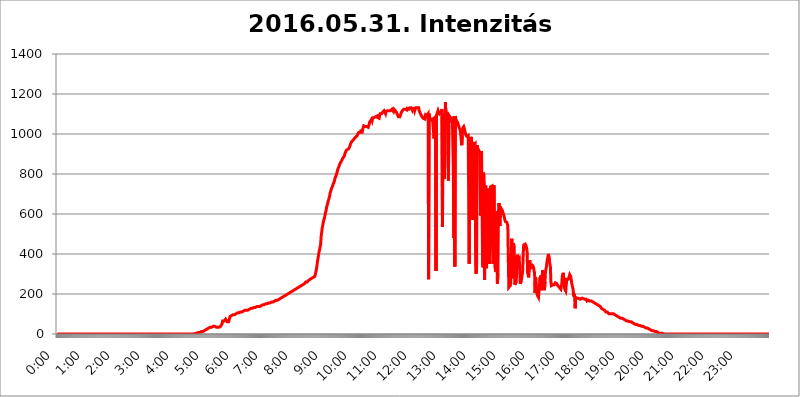
| Category | 2016.05.31. Intenzitás [W/m^2] |
|---|---|
| 0.0 | 0 |
| 0.0006944444444444445 | 0 |
| 0.001388888888888889 | 0 |
| 0.0020833333333333333 | 0 |
| 0.002777777777777778 | 0 |
| 0.003472222222222222 | 0 |
| 0.004166666666666667 | 0 |
| 0.004861111111111111 | 0 |
| 0.005555555555555556 | 0 |
| 0.0062499999999999995 | 0 |
| 0.006944444444444444 | 0 |
| 0.007638888888888889 | 0 |
| 0.008333333333333333 | 0 |
| 0.009027777777777779 | 0 |
| 0.009722222222222222 | 0 |
| 0.010416666666666666 | 0 |
| 0.011111111111111112 | 0 |
| 0.011805555555555555 | 0 |
| 0.012499999999999999 | 0 |
| 0.013194444444444444 | 0 |
| 0.013888888888888888 | 0 |
| 0.014583333333333332 | 0 |
| 0.015277777777777777 | 0 |
| 0.015972222222222224 | 0 |
| 0.016666666666666666 | 0 |
| 0.017361111111111112 | 0 |
| 0.018055555555555557 | 0 |
| 0.01875 | 0 |
| 0.019444444444444445 | 0 |
| 0.02013888888888889 | 0 |
| 0.020833333333333332 | 0 |
| 0.02152777777777778 | 0 |
| 0.022222222222222223 | 0 |
| 0.02291666666666667 | 0 |
| 0.02361111111111111 | 0 |
| 0.024305555555555556 | 0 |
| 0.024999999999999998 | 0 |
| 0.025694444444444447 | 0 |
| 0.02638888888888889 | 0 |
| 0.027083333333333334 | 0 |
| 0.027777777777777776 | 0 |
| 0.02847222222222222 | 0 |
| 0.029166666666666664 | 0 |
| 0.029861111111111113 | 0 |
| 0.030555555555555555 | 0 |
| 0.03125 | 0 |
| 0.03194444444444445 | 0 |
| 0.03263888888888889 | 0 |
| 0.03333333333333333 | 0 |
| 0.034027777777777775 | 0 |
| 0.034722222222222224 | 0 |
| 0.035416666666666666 | 0 |
| 0.036111111111111115 | 0 |
| 0.03680555555555556 | 0 |
| 0.0375 | 0 |
| 0.03819444444444444 | 0 |
| 0.03888888888888889 | 0 |
| 0.03958333333333333 | 0 |
| 0.04027777777777778 | 0 |
| 0.04097222222222222 | 0 |
| 0.041666666666666664 | 0 |
| 0.042361111111111106 | 0 |
| 0.04305555555555556 | 0 |
| 0.043750000000000004 | 0 |
| 0.044444444444444446 | 0 |
| 0.04513888888888889 | 0 |
| 0.04583333333333334 | 0 |
| 0.04652777777777778 | 0 |
| 0.04722222222222222 | 0 |
| 0.04791666666666666 | 0 |
| 0.04861111111111111 | 0 |
| 0.049305555555555554 | 0 |
| 0.049999999999999996 | 0 |
| 0.05069444444444445 | 0 |
| 0.051388888888888894 | 0 |
| 0.052083333333333336 | 0 |
| 0.05277777777777778 | 0 |
| 0.05347222222222222 | 0 |
| 0.05416666666666667 | 0 |
| 0.05486111111111111 | 0 |
| 0.05555555555555555 | 0 |
| 0.05625 | 0 |
| 0.05694444444444444 | 0 |
| 0.057638888888888885 | 0 |
| 0.05833333333333333 | 0 |
| 0.05902777777777778 | 0 |
| 0.059722222222222225 | 0 |
| 0.06041666666666667 | 0 |
| 0.061111111111111116 | 0 |
| 0.06180555555555556 | 0 |
| 0.0625 | 0 |
| 0.06319444444444444 | 0 |
| 0.06388888888888888 | 0 |
| 0.06458333333333334 | 0 |
| 0.06527777777777778 | 0 |
| 0.06597222222222222 | 0 |
| 0.06666666666666667 | 0 |
| 0.06736111111111111 | 0 |
| 0.06805555555555555 | 0 |
| 0.06874999999999999 | 0 |
| 0.06944444444444443 | 0 |
| 0.07013888888888889 | 0 |
| 0.07083333333333333 | 0 |
| 0.07152777777777779 | 0 |
| 0.07222222222222223 | 0 |
| 0.07291666666666667 | 0 |
| 0.07361111111111111 | 0 |
| 0.07430555555555556 | 0 |
| 0.075 | 0 |
| 0.07569444444444444 | 0 |
| 0.0763888888888889 | 0 |
| 0.07708333333333334 | 0 |
| 0.07777777777777778 | 0 |
| 0.07847222222222222 | 0 |
| 0.07916666666666666 | 0 |
| 0.0798611111111111 | 0 |
| 0.08055555555555556 | 0 |
| 0.08125 | 0 |
| 0.08194444444444444 | 0 |
| 0.08263888888888889 | 0 |
| 0.08333333333333333 | 0 |
| 0.08402777777777777 | 0 |
| 0.08472222222222221 | 0 |
| 0.08541666666666665 | 0 |
| 0.08611111111111112 | 0 |
| 0.08680555555555557 | 0 |
| 0.08750000000000001 | 0 |
| 0.08819444444444445 | 0 |
| 0.08888888888888889 | 0 |
| 0.08958333333333333 | 0 |
| 0.09027777777777778 | 0 |
| 0.09097222222222222 | 0 |
| 0.09166666666666667 | 0 |
| 0.09236111111111112 | 0 |
| 0.09305555555555556 | 0 |
| 0.09375 | 0 |
| 0.09444444444444444 | 0 |
| 0.09513888888888888 | 0 |
| 0.09583333333333333 | 0 |
| 0.09652777777777777 | 0 |
| 0.09722222222222222 | 0 |
| 0.09791666666666667 | 0 |
| 0.09861111111111111 | 0 |
| 0.09930555555555555 | 0 |
| 0.09999999999999999 | 0 |
| 0.10069444444444443 | 0 |
| 0.1013888888888889 | 0 |
| 0.10208333333333335 | 0 |
| 0.10277777777777779 | 0 |
| 0.10347222222222223 | 0 |
| 0.10416666666666667 | 0 |
| 0.10486111111111111 | 0 |
| 0.10555555555555556 | 0 |
| 0.10625 | 0 |
| 0.10694444444444444 | 0 |
| 0.1076388888888889 | 0 |
| 0.10833333333333334 | 0 |
| 0.10902777777777778 | 0 |
| 0.10972222222222222 | 0 |
| 0.1111111111111111 | 0 |
| 0.11180555555555556 | 0 |
| 0.11180555555555556 | 0 |
| 0.1125 | 0 |
| 0.11319444444444444 | 0 |
| 0.11388888888888889 | 0 |
| 0.11458333333333333 | 0 |
| 0.11527777777777777 | 0 |
| 0.11597222222222221 | 0 |
| 0.11666666666666665 | 0 |
| 0.1173611111111111 | 0 |
| 0.11805555555555557 | 0 |
| 0.11944444444444445 | 0 |
| 0.12013888888888889 | 0 |
| 0.12083333333333333 | 0 |
| 0.12152777777777778 | 0 |
| 0.12222222222222223 | 0 |
| 0.12291666666666667 | 0 |
| 0.12291666666666667 | 0 |
| 0.12361111111111112 | 0 |
| 0.12430555555555556 | 0 |
| 0.125 | 0 |
| 0.12569444444444444 | 0 |
| 0.12638888888888888 | 0 |
| 0.12708333333333333 | 0 |
| 0.16875 | 0 |
| 0.12847222222222224 | 0 |
| 0.12916666666666668 | 0 |
| 0.12986111111111112 | 0 |
| 0.13055555555555556 | 0 |
| 0.13125 | 0 |
| 0.13194444444444445 | 0 |
| 0.1326388888888889 | 0 |
| 0.13333333333333333 | 0 |
| 0.13402777777777777 | 0 |
| 0.13402777777777777 | 0 |
| 0.13472222222222222 | 0 |
| 0.13541666666666666 | 0 |
| 0.1361111111111111 | 0 |
| 0.13749999999999998 | 0 |
| 0.13819444444444443 | 0 |
| 0.1388888888888889 | 0 |
| 0.13958333333333334 | 0 |
| 0.14027777777777778 | 0 |
| 0.14097222222222222 | 0 |
| 0.14166666666666666 | 0 |
| 0.1423611111111111 | 0 |
| 0.14305555555555557 | 0 |
| 0.14375000000000002 | 0 |
| 0.14444444444444446 | 0 |
| 0.1451388888888889 | 0 |
| 0.1451388888888889 | 0 |
| 0.14652777777777778 | 0 |
| 0.14722222222222223 | 0 |
| 0.14791666666666667 | 0 |
| 0.1486111111111111 | 0 |
| 0.14930555555555555 | 0 |
| 0.15 | 0 |
| 0.15069444444444444 | 0 |
| 0.15138888888888888 | 0 |
| 0.15208333333333332 | 0 |
| 0.15277777777777776 | 0 |
| 0.15347222222222223 | 0 |
| 0.15416666666666667 | 0 |
| 0.15486111111111112 | 0 |
| 0.15555555555555556 | 0 |
| 0.15625 | 0 |
| 0.15694444444444444 | 0 |
| 0.15763888888888888 | 0 |
| 0.15833333333333333 | 0 |
| 0.15902777777777777 | 0 |
| 0.15972222222222224 | 0 |
| 0.16041666666666668 | 0 |
| 0.16111111111111112 | 0 |
| 0.16180555555555556 | 0 |
| 0.1625 | 0 |
| 0.16319444444444445 | 0 |
| 0.1638888888888889 | 0 |
| 0.16458333333333333 | 0 |
| 0.16527777777777777 | 0 |
| 0.16597222222222222 | 0 |
| 0.16666666666666666 | 0 |
| 0.1673611111111111 | 0 |
| 0.16805555555555554 | 0 |
| 0.16874999999999998 | 0 |
| 0.16944444444444443 | 0 |
| 0.17013888888888887 | 0 |
| 0.1708333333333333 | 0 |
| 0.17152777777777775 | 0 |
| 0.17222222222222225 | 0 |
| 0.1729166666666667 | 0 |
| 0.17361111111111113 | 0 |
| 0.17430555555555557 | 0 |
| 0.17500000000000002 | 0 |
| 0.17569444444444446 | 0 |
| 0.1763888888888889 | 0 |
| 0.17708333333333334 | 0 |
| 0.17777777777777778 | 0 |
| 0.17847222222222223 | 0 |
| 0.17916666666666667 | 0 |
| 0.1798611111111111 | 0 |
| 0.18055555555555555 | 0 |
| 0.18125 | 0 |
| 0.18194444444444444 | 0 |
| 0.1826388888888889 | 0 |
| 0.18333333333333335 | 0 |
| 0.1840277777777778 | 0 |
| 0.18472222222222223 | 0 |
| 0.18541666666666667 | 0 |
| 0.18611111111111112 | 0 |
| 0.18680555555555556 | 0 |
| 0.1875 | 0 |
| 0.18819444444444444 | 0 |
| 0.18888888888888888 | 0 |
| 0.18958333333333333 | 0 |
| 0.19027777777777777 | 0 |
| 0.1909722222222222 | 0 |
| 0.19166666666666665 | 0 |
| 0.19236111111111112 | 3.525 |
| 0.19305555555555554 | 3.525 |
| 0.19375 | 3.525 |
| 0.19444444444444445 | 3.525 |
| 0.1951388888888889 | 3.525 |
| 0.19583333333333333 | 3.525 |
| 0.19652777777777777 | 3.525 |
| 0.19722222222222222 | 3.525 |
| 0.19791666666666666 | 7.887 |
| 0.1986111111111111 | 7.887 |
| 0.19930555555555554 | 7.887 |
| 0.19999999999999998 | 7.887 |
| 0.20069444444444443 | 7.887 |
| 0.20138888888888887 | 12.257 |
| 0.2020833333333333 | 12.257 |
| 0.2027777777777778 | 12.257 |
| 0.2034722222222222 | 12.257 |
| 0.2041666666666667 | 12.257 |
| 0.20486111111111113 | 16.636 |
| 0.20555555555555557 | 16.636 |
| 0.20625000000000002 | 16.636 |
| 0.20694444444444446 | 21.024 |
| 0.2076388888888889 | 21.024 |
| 0.20833333333333334 | 21.024 |
| 0.20902777777777778 | 21.024 |
| 0.20972222222222223 | 25.419 |
| 0.21041666666666667 | 25.419 |
| 0.2111111111111111 | 25.419 |
| 0.21180555555555555 | 29.823 |
| 0.2125 | 29.823 |
| 0.21319444444444444 | 29.823 |
| 0.2138888888888889 | 29.823 |
| 0.21458333333333335 | 34.234 |
| 0.2152777777777778 | 34.234 |
| 0.21597222222222223 | 34.234 |
| 0.21666666666666667 | 34.234 |
| 0.21736111111111112 | 34.234 |
| 0.21805555555555556 | 38.653 |
| 0.21875 | 38.653 |
| 0.21944444444444444 | 38.653 |
| 0.22013888888888888 | 38.653 |
| 0.22083333333333333 | 38.653 |
| 0.22152777777777777 | 43.079 |
| 0.2222222222222222 | 38.653 |
| 0.22291666666666665 | 34.234 |
| 0.2236111111111111 | 38.653 |
| 0.22430555555555556 | 38.653 |
| 0.225 | 34.234 |
| 0.22569444444444445 | 38.653 |
| 0.2263888888888889 | 34.234 |
| 0.22708333333333333 | 34.234 |
| 0.22777777777777777 | 34.234 |
| 0.22847222222222222 | 34.234 |
| 0.22916666666666666 | 38.653 |
| 0.2298611111111111 | 38.653 |
| 0.23055555555555554 | 38.653 |
| 0.23124999999999998 | 51.951 |
| 0.23194444444444443 | 65.31 |
| 0.23263888888888887 | 65.31 |
| 0.2333333333333333 | 69.775 |
| 0.2340277777777778 | 65.31 |
| 0.2347222222222222 | 69.775 |
| 0.2354166666666667 | 69.775 |
| 0.23611111111111113 | 74.246 |
| 0.23680555555555557 | 74.246 |
| 0.23750000000000002 | 69.775 |
| 0.23819444444444446 | 60.85 |
| 0.2388888888888889 | 56.398 |
| 0.23958333333333334 | 56.398 |
| 0.24027777777777778 | 60.85 |
| 0.24097222222222223 | 65.31 |
| 0.24166666666666667 | 78.722 |
| 0.2423611111111111 | 87.692 |
| 0.24305555555555555 | 87.692 |
| 0.24375 | 92.184 |
| 0.24444444444444446 | 92.184 |
| 0.24513888888888888 | 92.184 |
| 0.24583333333333335 | 92.184 |
| 0.2465277777777778 | 96.682 |
| 0.24722222222222223 | 96.682 |
| 0.24791666666666667 | 96.682 |
| 0.24861111111111112 | 96.682 |
| 0.24930555555555556 | 101.184 |
| 0.25 | 101.184 |
| 0.25069444444444444 | 101.184 |
| 0.2513888888888889 | 101.184 |
| 0.2520833333333333 | 101.184 |
| 0.25277777777777777 | 105.69 |
| 0.2534722222222222 | 105.69 |
| 0.25416666666666665 | 105.69 |
| 0.2548611111111111 | 105.69 |
| 0.2555555555555556 | 110.201 |
| 0.25625000000000003 | 110.201 |
| 0.2569444444444445 | 110.201 |
| 0.2576388888888889 | 110.201 |
| 0.25833333333333336 | 110.201 |
| 0.2590277777777778 | 110.201 |
| 0.25972222222222224 | 110.201 |
| 0.2604166666666667 | 114.716 |
| 0.2611111111111111 | 114.716 |
| 0.26180555555555557 | 114.716 |
| 0.2625 | 114.716 |
| 0.26319444444444445 | 119.235 |
| 0.2638888888888889 | 119.235 |
| 0.26458333333333334 | 119.235 |
| 0.2652777777777778 | 119.235 |
| 0.2659722222222222 | 119.235 |
| 0.26666666666666666 | 119.235 |
| 0.2673611111111111 | 119.235 |
| 0.26805555555555555 | 123.758 |
| 0.26875 | 123.758 |
| 0.26944444444444443 | 123.758 |
| 0.2701388888888889 | 123.758 |
| 0.2708333333333333 | 128.284 |
| 0.27152777777777776 | 128.284 |
| 0.2722222222222222 | 128.284 |
| 0.27291666666666664 | 128.284 |
| 0.2736111111111111 | 128.284 |
| 0.2743055555555555 | 128.284 |
| 0.27499999999999997 | 128.284 |
| 0.27569444444444446 | 132.814 |
| 0.27638888888888885 | 132.814 |
| 0.27708333333333335 | 132.814 |
| 0.2777777777777778 | 132.814 |
| 0.27847222222222223 | 132.814 |
| 0.2791666666666667 | 132.814 |
| 0.2798611111111111 | 137.347 |
| 0.28055555555555556 | 137.347 |
| 0.28125 | 137.347 |
| 0.28194444444444444 | 137.347 |
| 0.2826388888888889 | 137.347 |
| 0.2833333333333333 | 137.347 |
| 0.28402777777777777 | 137.347 |
| 0.2847222222222222 | 141.884 |
| 0.28541666666666665 | 141.884 |
| 0.28611111111111115 | 141.884 |
| 0.28680555555555554 | 141.884 |
| 0.28750000000000003 | 141.884 |
| 0.2881944444444445 | 146.423 |
| 0.2888888888888889 | 146.423 |
| 0.28958333333333336 | 146.423 |
| 0.2902777777777778 | 146.423 |
| 0.29097222222222224 | 146.423 |
| 0.2916666666666667 | 146.423 |
| 0.2923611111111111 | 150.964 |
| 0.29305555555555557 | 150.964 |
| 0.29375 | 150.964 |
| 0.29444444444444445 | 150.964 |
| 0.2951388888888889 | 150.964 |
| 0.29583333333333334 | 150.964 |
| 0.2965277777777778 | 155.509 |
| 0.2972222222222222 | 155.509 |
| 0.29791666666666666 | 155.509 |
| 0.2986111111111111 | 155.509 |
| 0.29930555555555555 | 155.509 |
| 0.3 | 155.509 |
| 0.30069444444444443 | 160.056 |
| 0.3013888888888889 | 160.056 |
| 0.3020833333333333 | 160.056 |
| 0.30277777777777776 | 160.056 |
| 0.3034722222222222 | 164.605 |
| 0.30416666666666664 | 164.605 |
| 0.3048611111111111 | 164.605 |
| 0.3055555555555555 | 164.605 |
| 0.30624999999999997 | 164.605 |
| 0.3069444444444444 | 169.156 |
| 0.3076388888888889 | 164.605 |
| 0.30833333333333335 | 164.605 |
| 0.3090277777777778 | 169.156 |
| 0.30972222222222223 | 169.156 |
| 0.3104166666666667 | 173.709 |
| 0.3111111111111111 | 173.709 |
| 0.31180555555555556 | 173.709 |
| 0.3125 | 178.264 |
| 0.31319444444444444 | 178.264 |
| 0.3138888888888889 | 178.264 |
| 0.3145833333333333 | 182.82 |
| 0.31527777777777777 | 182.82 |
| 0.3159722222222222 | 182.82 |
| 0.31666666666666665 | 187.378 |
| 0.31736111111111115 | 187.378 |
| 0.31805555555555554 | 187.378 |
| 0.31875000000000003 | 191.937 |
| 0.3194444444444445 | 191.937 |
| 0.3201388888888889 | 191.937 |
| 0.32083333333333336 | 196.497 |
| 0.3215277777777778 | 196.497 |
| 0.32222222222222224 | 196.497 |
| 0.3229166666666667 | 201.058 |
| 0.3236111111111111 | 201.058 |
| 0.32430555555555557 | 201.058 |
| 0.325 | 201.058 |
| 0.32569444444444445 | 205.62 |
| 0.3263888888888889 | 205.62 |
| 0.32708333333333334 | 210.182 |
| 0.3277777777777778 | 210.182 |
| 0.3284722222222222 | 210.182 |
| 0.32916666666666666 | 214.746 |
| 0.3298611111111111 | 214.746 |
| 0.33055555555555555 | 214.746 |
| 0.33125 | 219.309 |
| 0.33194444444444443 | 219.309 |
| 0.3326388888888889 | 219.309 |
| 0.3333333333333333 | 223.873 |
| 0.3340277777777778 | 223.873 |
| 0.3347222222222222 | 228.436 |
| 0.3354166666666667 | 228.436 |
| 0.3361111111111111 | 228.436 |
| 0.3368055555555556 | 233 |
| 0.33749999999999997 | 233 |
| 0.33819444444444446 | 233 |
| 0.33888888888888885 | 233 |
| 0.33958333333333335 | 233 |
| 0.34027777777777773 | 237.564 |
| 0.34097222222222223 | 242.127 |
| 0.3416666666666666 | 242.127 |
| 0.3423611111111111 | 242.127 |
| 0.3430555555555555 | 246.689 |
| 0.34375 | 246.689 |
| 0.3444444444444445 | 246.689 |
| 0.3451388888888889 | 251.251 |
| 0.3458333333333334 | 251.251 |
| 0.34652777777777777 | 251.251 |
| 0.34722222222222227 | 255.813 |
| 0.34791666666666665 | 255.813 |
| 0.34861111111111115 | 260.373 |
| 0.34930555555555554 | 260.373 |
| 0.35000000000000003 | 260.373 |
| 0.3506944444444444 | 260.373 |
| 0.3513888888888889 | 264.932 |
| 0.3520833333333333 | 264.932 |
| 0.3527777777777778 | 269.49 |
| 0.3534722222222222 | 269.49 |
| 0.3541666666666667 | 269.49 |
| 0.3548611111111111 | 274.047 |
| 0.35555555555555557 | 274.047 |
| 0.35625 | 278.603 |
| 0.35694444444444445 | 278.603 |
| 0.3576388888888889 | 278.603 |
| 0.35833333333333334 | 283.156 |
| 0.3590277777777778 | 283.156 |
| 0.3597222222222222 | 287.709 |
| 0.36041666666666666 | 287.709 |
| 0.3611111111111111 | 287.709 |
| 0.36180555555555555 | 296.808 |
| 0.3625 | 305.898 |
| 0.36319444444444443 | 319.517 |
| 0.3638888888888889 | 333.113 |
| 0.3645833333333333 | 351.198 |
| 0.3652777777777778 | 369.23 |
| 0.3659722222222222 | 382.715 |
| 0.3666666666666667 | 400.638 |
| 0.3673611111111111 | 414.035 |
| 0.3680555555555556 | 422.943 |
| 0.36874999999999997 | 436.27 |
| 0.36944444444444446 | 449.551 |
| 0.37013888888888885 | 489.108 |
| 0.37083333333333335 | 506.542 |
| 0.37152777777777773 | 528.2 |
| 0.37222222222222223 | 541.121 |
| 0.3729166666666666 | 553.986 |
| 0.3736111111111111 | 566.793 |
| 0.3743055555555555 | 575.299 |
| 0.375 | 583.779 |
| 0.3756944444444445 | 596.45 |
| 0.3763888888888889 | 609.062 |
| 0.3770833333333334 | 617.436 |
| 0.37777777777777777 | 634.105 |
| 0.37847222222222227 | 634.105 |
| 0.37916666666666665 | 650.667 |
| 0.37986111111111115 | 663.019 |
| 0.38055555555555554 | 671.22 |
| 0.38125000000000003 | 675.311 |
| 0.3819444444444444 | 687.544 |
| 0.3826388888888889 | 703.762 |
| 0.3833333333333333 | 711.832 |
| 0.3840277777777778 | 719.877 |
| 0.3847222222222222 | 727.896 |
| 0.3854166666666667 | 731.896 |
| 0.3861111111111111 | 739.877 |
| 0.38680555555555557 | 747.834 |
| 0.3875 | 751.803 |
| 0.38819444444444445 | 759.723 |
| 0.3888888888888889 | 767.62 |
| 0.38958333333333334 | 779.42 |
| 0.3902777777777778 | 783.342 |
| 0.3909722222222222 | 791.169 |
| 0.39166666666666666 | 798.974 |
| 0.3923611111111111 | 806.757 |
| 0.39305555555555555 | 818.392 |
| 0.39375 | 826.123 |
| 0.39444444444444443 | 829.981 |
| 0.3951388888888889 | 837.682 |
| 0.3958333333333333 | 845.365 |
| 0.3965277777777778 | 849.199 |
| 0.3972222222222222 | 856.855 |
| 0.3979166666666667 | 860.676 |
| 0.3986111111111111 | 864.493 |
| 0.3993055555555556 | 868.305 |
| 0.39999999999999997 | 875.918 |
| 0.40069444444444446 | 879.719 |
| 0.40138888888888885 | 883.516 |
| 0.40208333333333335 | 887.309 |
| 0.40277777777777773 | 891.099 |
| 0.40347222222222223 | 902.447 |
| 0.4041666666666666 | 906.223 |
| 0.4048611111111111 | 913.766 |
| 0.4055555555555555 | 917.534 |
| 0.40625 | 921.298 |
| 0.4069444444444445 | 921.298 |
| 0.4076388888888889 | 925.06 |
| 0.4083333333333334 | 925.06 |
| 0.40902777777777777 | 928.819 |
| 0.40972222222222227 | 932.576 |
| 0.41041666666666665 | 940.082 |
| 0.41111111111111115 | 947.58 |
| 0.41180555555555554 | 955.071 |
| 0.41250000000000003 | 958.814 |
| 0.4131944444444444 | 962.555 |
| 0.4138888888888889 | 966.295 |
| 0.4145833333333333 | 966.295 |
| 0.4152777777777778 | 970.034 |
| 0.4159722222222222 | 966.295 |
| 0.4166666666666667 | 977.508 |
| 0.4173611111111111 | 977.508 |
| 0.41805555555555557 | 981.244 |
| 0.41875 | 984.98 |
| 0.41944444444444445 | 988.714 |
| 0.4201388888888889 | 988.714 |
| 0.42083333333333334 | 992.448 |
| 0.4215277777777778 | 999.916 |
| 0.4222222222222222 | 1003.65 |
| 0.42291666666666666 | 1007.383 |
| 0.4236111111111111 | 1003.65 |
| 0.42430555555555555 | 1007.383 |
| 0.425 | 1007.383 |
| 0.42569444444444443 | 1014.852 |
| 0.4263888888888889 | 1014.852 |
| 0.4270833333333333 | 1014.852 |
| 0.4277777777777778 | 1011.118 |
| 0.4284722222222222 | 1026.06 |
| 0.4291666666666667 | 1029.798 |
| 0.4298611111111111 | 1041.019 |
| 0.4305555555555556 | 1041.019 |
| 0.43124999999999997 | 1037.277 |
| 0.43194444444444446 | 1037.277 |
| 0.43263888888888885 | 1037.277 |
| 0.43333333333333335 | 1033.537 |
| 0.43402777777777773 | 1037.277 |
| 0.43472222222222223 | 1033.537 |
| 0.4354166666666666 | 1037.277 |
| 0.4361111111111111 | 1033.537 |
| 0.4368055555555555 | 1041.019 |
| 0.4375 | 1048.508 |
| 0.4381944444444445 | 1059.756 |
| 0.4388888888888889 | 1059.756 |
| 0.4395833333333334 | 1067.267 |
| 0.44027777777777777 | 1067.267 |
| 0.44097222222222227 | 1074.789 |
| 0.44166666666666665 | 1067.267 |
| 0.44236111111111115 | 1078.555 |
| 0.44305555555555554 | 1082.324 |
| 0.44375000000000003 | 1078.555 |
| 0.4444444444444444 | 1082.324 |
| 0.4451388888888889 | 1078.555 |
| 0.4458333333333333 | 1082.324 |
| 0.4465277777777778 | 1086.097 |
| 0.4472222222222222 | 1086.097 |
| 0.4479166666666667 | 1086.097 |
| 0.4486111111111111 | 1089.873 |
| 0.44930555555555557 | 1082.324 |
| 0.45 | 1086.097 |
| 0.45069444444444445 | 1082.324 |
| 0.4513888888888889 | 1078.555 |
| 0.45208333333333334 | 1093.653 |
| 0.4527777777777778 | 1101.226 |
| 0.4534722222222222 | 1101.226 |
| 0.45416666666666666 | 1097.437 |
| 0.4548611111111111 | 1101.226 |
| 0.45555555555555555 | 1101.226 |
| 0.45625 | 1108.816 |
| 0.45694444444444443 | 1108.816 |
| 0.4576388888888889 | 1105.019 |
| 0.4583333333333333 | 1116.426 |
| 0.4590277777777778 | 1112.618 |
| 0.4597222222222222 | 1112.618 |
| 0.4604166666666667 | 1101.226 |
| 0.4611111111111111 | 1112.618 |
| 0.4618055555555556 | 1116.426 |
| 0.46249999999999997 | 1108.816 |
| 0.46319444444444446 | 1116.426 |
| 0.46388888888888885 | 1116.426 |
| 0.46458333333333335 | 1120.238 |
| 0.46527777777777773 | 1116.426 |
| 0.46597222222222223 | 1116.426 |
| 0.4666666666666666 | 1116.426 |
| 0.4673611111111111 | 1116.426 |
| 0.4680555555555555 | 1116.426 |
| 0.46875 | 1112.618 |
| 0.4694444444444445 | 1124.056 |
| 0.4701388888888889 | 1124.056 |
| 0.4708333333333334 | 1120.238 |
| 0.47152777777777777 | 1112.618 |
| 0.47222222222222227 | 1124.056 |
| 0.47291666666666665 | 1124.056 |
| 0.47361111111111115 | 1124.056 |
| 0.47430555555555554 | 1116.426 |
| 0.47500000000000003 | 1116.426 |
| 0.4756944444444444 | 1108.816 |
| 0.4763888888888889 | 1105.019 |
| 0.4770833333333333 | 1097.437 |
| 0.4777777777777778 | 1093.653 |
| 0.4784722222222222 | 1086.097 |
| 0.4791666666666667 | 1082.324 |
| 0.4798611111111111 | 1082.324 |
| 0.48055555555555557 | 1086.097 |
| 0.48125 | 1093.653 |
| 0.48194444444444445 | 1093.653 |
| 0.4826388888888889 | 1108.816 |
| 0.48333333333333334 | 1112.618 |
| 0.4840277777777778 | 1116.426 |
| 0.4847222222222222 | 1116.426 |
| 0.48541666666666666 | 1120.238 |
| 0.4861111111111111 | 1124.056 |
| 0.48680555555555555 | 1127.879 |
| 0.4875 | 1127.879 |
| 0.48819444444444443 | 1124.056 |
| 0.4888888888888889 | 1124.056 |
| 0.4895833333333333 | 1127.879 |
| 0.4902777777777778 | 1120.238 |
| 0.4909722222222222 | 1127.879 |
| 0.4916666666666667 | 1124.056 |
| 0.4923611111111111 | 1124.056 |
| 0.4930555555555556 | 1124.056 |
| 0.49374999999999997 | 1124.056 |
| 0.49444444444444446 | 1131.708 |
| 0.49513888888888885 | 1127.879 |
| 0.49583333333333335 | 1135.543 |
| 0.49652777777777773 | 1131.708 |
| 0.49722222222222223 | 1127.879 |
| 0.4979166666666666 | 1120.238 |
| 0.4986111111111111 | 1127.879 |
| 0.4993055555555555 | 1127.879 |
| 0.5 | 1131.708 |
| 0.5006944444444444 | 1127.879 |
| 0.5013888888888889 | 1116.426 |
| 0.5020833333333333 | 1124.056 |
| 0.5027777777777778 | 1131.708 |
| 0.5034722222222222 | 1131.708 |
| 0.5041666666666667 | 1131.708 |
| 0.5048611111111111 | 1131.708 |
| 0.5055555555555555 | 1127.879 |
| 0.50625 | 1127.879 |
| 0.5069444444444444 | 1131.708 |
| 0.5076388888888889 | 1116.426 |
| 0.5083333333333333 | 1112.618 |
| 0.5090277777777777 | 1105.019 |
| 0.5097222222222222 | 1101.226 |
| 0.5104166666666666 | 1093.653 |
| 0.5111111111111112 | 1093.653 |
| 0.5118055555555555 | 1086.097 |
| 0.5125000000000001 | 1082.324 |
| 0.5131944444444444 | 1078.555 |
| 0.513888888888889 | 1078.555 |
| 0.5145833333333333 | 1078.555 |
| 0.5152777777777778 | 1074.789 |
| 0.5159722222222222 | 1086.097 |
| 0.5166666666666667 | 1097.437 |
| 0.517361111111111 | 1097.437 |
| 0.5180555555555556 | 1097.437 |
| 0.5187499999999999 | 1093.653 |
| 0.5194444444444445 | 1093.653 |
| 0.5201388888888888 | 1101.226 |
| 0.5208333333333334 | 274.047 |
| 0.5215277777777778 | 1101.226 |
| 0.5222222222222223 | 1086.097 |
| 0.5229166666666667 | 1078.555 |
| 0.5236111111111111 | 1074.789 |
| 0.5243055555555556 | 1071.027 |
| 0.525 | 1071.027 |
| 0.5256944444444445 | 1074.789 |
| 0.5263888888888889 | 1074.789 |
| 0.5270833333333333 | 1078.555 |
| 0.5277777777777778 | 1074.789 |
| 0.5284722222222222 | 977.508 |
| 0.5291666666666667 | 1067.267 |
| 0.5298611111111111 | 1082.324 |
| 0.5305555555555556 | 1089.873 |
| 0.53125 | 314.98 |
| 0.5319444444444444 | 1093.653 |
| 0.5326388888888889 | 1101.226 |
| 0.5333333333333333 | 1105.019 |
| 0.5340277777777778 | 1116.426 |
| 0.5347222222222222 | 1108.816 |
| 0.5354166666666667 | 1105.019 |
| 0.5361111111111111 | 1101.226 |
| 0.5368055555555555 | 1101.226 |
| 0.5375 | 1101.226 |
| 0.5381944444444444 | 1108.816 |
| 0.5388888888888889 | 1112.618 |
| 0.5395833333333333 | 1124.056 |
| 0.5402777777777777 | 536.82 |
| 0.5409722222222222 | 1105.019 |
| 0.5416666666666666 | 783.342 |
| 0.5423611111111112 | 1101.226 |
| 0.5430555555555555 | 775.492 |
| 0.5437500000000001 | 913.766 |
| 0.5444444444444444 | 1158.689 |
| 0.545138888888889 | 1082.324 |
| 0.5458333333333333 | 1108.816 |
| 0.5465277777777778 | 1101.226 |
| 0.5472222222222222 | 1089.873 |
| 0.5479166666666667 | 1086.097 |
| 0.548611111111111 | 767.62 |
| 0.5493055555555556 | 1093.653 |
| 0.5499999999999999 | 1089.873 |
| 0.5506944444444445 | 1086.097 |
| 0.5513888888888888 | 1056.004 |
| 0.5520833333333334 | 1078.555 |
| 0.5527777777777778 | 1074.789 |
| 0.5534722222222223 | 1082.324 |
| 0.5541666666666667 | 1078.555 |
| 0.5548611111111111 | 1078.555 |
| 0.5555555555555556 | 798.974 |
| 0.55625 | 480.356 |
| 0.5569444444444445 | 1089.873 |
| 0.5576388888888889 | 337.639 |
| 0.5583333333333333 | 1089.873 |
| 0.5590277777777778 | 1074.789 |
| 0.5597222222222222 | 1071.027 |
| 0.5604166666666667 | 1063.51 |
| 0.5611111111111111 | 1063.51 |
| 0.5618055555555556 | 1056.004 |
| 0.5625 | 1044.762 |
| 0.5631944444444444 | 1037.277 |
| 0.5638888888888889 | 1029.798 |
| 0.5645833333333333 | 1026.06 |
| 0.5652777777777778 | 1018.587 |
| 0.5659722222222222 | 1022.323 |
| 0.5666666666666667 | 1014.852 |
| 0.5673611111111111 | 943.832 |
| 0.5680555555555555 | 988.714 |
| 0.56875 | 1029.798 |
| 0.5694444444444444 | 1029.798 |
| 0.5701388888888889 | 1037.277 |
| 0.5708333333333333 | 1029.798 |
| 0.5715277777777777 | 1033.537 |
| 0.5722222222222222 | 1007.383 |
| 0.5729166666666666 | 996.182 |
| 0.5736111111111112 | 992.448 |
| 0.5743055555555555 | 988.714 |
| 0.5750000000000001 | 992.448 |
| 0.5756944444444444 | 988.714 |
| 0.576388888888889 | 992.448 |
| 0.5770833333333333 | 988.714 |
| 0.5777777777777778 | 351.198 |
| 0.5784722222222222 | 955.071 |
| 0.5791666666666667 | 984.98 |
| 0.579861111111111 | 977.508 |
| 0.5805555555555556 | 984.98 |
| 0.5812499999999999 | 962.555 |
| 0.5819444444444445 | 955.071 |
| 0.5826388888888888 | 571.049 |
| 0.5833333333333334 | 958.814 |
| 0.5840277777777778 | 943.832 |
| 0.5847222222222223 | 947.58 |
| 0.5854166666666667 | 947.58 |
| 0.5861111111111111 | 951.327 |
| 0.5868055555555556 | 342.162 |
| 0.5875 | 301.354 |
| 0.5881944444444445 | 346.682 |
| 0.5888888888888889 | 943.832 |
| 0.5895833333333333 | 928.819 |
| 0.5902777777777778 | 925.06 |
| 0.5909722222222222 | 921.298 |
| 0.5916666666666667 | 917.534 |
| 0.5923611111111111 | 909.996 |
| 0.5930555555555556 | 913.766 |
| 0.59375 | 592.233 |
| 0.5944444444444444 | 913.766 |
| 0.5951388888888889 | 906.223 |
| 0.5958333333333333 | 906.223 |
| 0.5965277777777778 | 355.712 |
| 0.5972222222222222 | 333.113 |
| 0.5979166666666667 | 806.757 |
| 0.5986111111111111 | 743.859 |
| 0.5993055555555555 | 269.49 |
| 0.6 | 269.49 |
| 0.6006944444444444 | 743.859 |
| 0.6013888888888889 | 719.877 |
| 0.6020833333333333 | 328.584 |
| 0.6027777777777777 | 588.009 |
| 0.6034722222222222 | 646.537 |
| 0.6041666666666666 | 727.896 |
| 0.6048611111111112 | 731.896 |
| 0.6055555555555555 | 731.896 |
| 0.6062500000000001 | 351.198 |
| 0.6069444444444444 | 346.682 |
| 0.607638888888889 | 735.89 |
| 0.6083333333333333 | 735.89 |
| 0.6090277777777778 | 731.896 |
| 0.6097222222222222 | 739.877 |
| 0.6104166666666667 | 735.89 |
| 0.611111111111111 | 351.198 |
| 0.6118055555555556 | 373.729 |
| 0.6124999999999999 | 743.859 |
| 0.6131944444444445 | 462.786 |
| 0.6138888888888888 | 333.113 |
| 0.6145833333333334 | 324.052 |
| 0.6152777777777778 | 310.44 |
| 0.6159722222222223 | 333.113 |
| 0.6166666666666667 | 613.252 |
| 0.6173611111111111 | 251.251 |
| 0.6180555555555556 | 301.354 |
| 0.61875 | 604.864 |
| 0.6194444444444445 | 654.791 |
| 0.6201388888888889 | 634.105 |
| 0.6208333333333333 | 541.121 |
| 0.6215277777777778 | 625.784 |
| 0.6222222222222222 | 617.436 |
| 0.6229166666666667 | 625.784 |
| 0.6236111111111111 | 625.784 |
| 0.6243055555555556 | 617.436 |
| 0.625 | 609.062 |
| 0.6256944444444444 | 600.661 |
| 0.6263888888888889 | 592.233 |
| 0.6270833333333333 | 583.779 |
| 0.6277777777777778 | 571.049 |
| 0.6284722222222222 | 562.53 |
| 0.6291666666666667 | 566.793 |
| 0.6298611111111111 | 558.261 |
| 0.6305555555555555 | 558.261 |
| 0.63125 | 558.261 |
| 0.6319444444444444 | 541.121 |
| 0.6326388888888889 | 373.729 |
| 0.6333333333333333 | 233 |
| 0.6340277777777777 | 228.436 |
| 0.6347222222222222 | 228.436 |
| 0.6354166666666666 | 242.127 |
| 0.6361111111111112 | 255.813 |
| 0.6368055555555555 | 391.685 |
| 0.6375000000000001 | 475.972 |
| 0.6381944444444444 | 278.603 |
| 0.638888888888889 | 387.202 |
| 0.6395833333333333 | 453.968 |
| 0.6402777777777778 | 445.129 |
| 0.6409722222222222 | 436.27 |
| 0.6416666666666667 | 246.689 |
| 0.642361111111111 | 251.251 |
| 0.6430555555555556 | 251.251 |
| 0.6437499999999999 | 260.373 |
| 0.6444444444444445 | 255.813 |
| 0.6451388888888888 | 396.164 |
| 0.6458333333333334 | 378.224 |
| 0.6465277777777778 | 378.224 |
| 0.6472222222222223 | 378.224 |
| 0.6479166666666667 | 382.715 |
| 0.6486111111111111 | 387.202 |
| 0.6493055555555556 | 251.251 |
| 0.65 | 255.813 |
| 0.6506944444444445 | 264.932 |
| 0.6513888888888889 | 283.156 |
| 0.6520833333333333 | 296.808 |
| 0.6527777777777778 | 314.98 |
| 0.6534722222222222 | 391.685 |
| 0.6541666666666667 | 445.129 |
| 0.6548611111111111 | 449.551 |
| 0.6555555555555556 | 449.551 |
| 0.65625 | 449.551 |
| 0.6569444444444444 | 445.129 |
| 0.6576388888888889 | 440.702 |
| 0.6583333333333333 | 427.39 |
| 0.6590277777777778 | 409.574 |
| 0.6597222222222222 | 305.898 |
| 0.6604166666666667 | 296.808 |
| 0.6611111111111111 | 283.156 |
| 0.6618055555555555 | 333.113 |
| 0.6625 | 369.23 |
| 0.6631944444444444 | 355.712 |
| 0.6638888888888889 | 342.162 |
| 0.6645833333333333 | 333.113 |
| 0.6652777777777777 | 333.113 |
| 0.6659722222222222 | 337.639 |
| 0.6666666666666666 | 342.162 |
| 0.6673611111111111 | 337.639 |
| 0.6680555555555556 | 333.113 |
| 0.6687500000000001 | 314.98 |
| 0.6694444444444444 | 305.898 |
| 0.6701388888888888 | 205.62 |
| 0.6708333333333334 | 283.156 |
| 0.6715277777777778 | 283.156 |
| 0.6722222222222222 | 214.746 |
| 0.6729166666666666 | 201.058 |
| 0.6736111111111112 | 191.937 |
| 0.6743055555555556 | 187.378 |
| 0.6749999999999999 | 182.82 |
| 0.6756944444444444 | 182.82 |
| 0.6763888888888889 | 242.127 |
| 0.6770833333333334 | 283.156 |
| 0.6777777777777777 | 255.813 |
| 0.6784722222222223 | 292.259 |
| 0.6791666666666667 | 219.309 |
| 0.6798611111111111 | 228.436 |
| 0.6805555555555555 | 319.517 |
| 0.68125 | 305.898 |
| 0.6819444444444445 | 287.709 |
| 0.6826388888888889 | 305.898 |
| 0.6833333333333332 | 219.309 |
| 0.6840277777777778 | 260.373 |
| 0.6847222222222222 | 310.44 |
| 0.6854166666666667 | 324.052 |
| 0.686111111111111 | 337.639 |
| 0.6868055555555556 | 360.221 |
| 0.6875 | 373.729 |
| 0.6881944444444444 | 387.202 |
| 0.688888888888889 | 400.638 |
| 0.6895833333333333 | 396.164 |
| 0.6902777777777778 | 364.728 |
| 0.6909722222222222 | 360.221 |
| 0.6916666666666668 | 333.113 |
| 0.6923611111111111 | 260.373 |
| 0.6930555555555555 | 242.127 |
| 0.69375 | 242.127 |
| 0.6944444444444445 | 246.689 |
| 0.6951388888888889 | 246.689 |
| 0.6958333333333333 | 246.689 |
| 0.6965277777777777 | 242.127 |
| 0.6972222222222223 | 246.689 |
| 0.6979166666666666 | 251.251 |
| 0.6986111111111111 | 255.813 |
| 0.6993055555555556 | 260.373 |
| 0.7000000000000001 | 251.251 |
| 0.7006944444444444 | 251.251 |
| 0.7013888888888888 | 246.689 |
| 0.7020833333333334 | 242.127 |
| 0.7027777777777778 | 237.564 |
| 0.7034722222222222 | 237.564 |
| 0.7041666666666666 | 233 |
| 0.7048611111111112 | 228.436 |
| 0.7055555555555556 | 228.436 |
| 0.7062499999999999 | 223.873 |
| 0.7069444444444444 | 228.436 |
| 0.7076388888888889 | 251.251 |
| 0.7083333333333334 | 287.709 |
| 0.7090277777777777 | 296.808 |
| 0.7097222222222223 | 305.898 |
| 0.7104166666666667 | 301.354 |
| 0.7111111111111111 | 237.564 |
| 0.7118055555555555 | 223.873 |
| 0.7125 | 219.309 |
| 0.7131944444444445 | 214.746 |
| 0.7138888888888889 | 214.746 |
| 0.7145833333333332 | 274.047 |
| 0.7152777777777778 | 274.047 |
| 0.7159722222222222 | 274.047 |
| 0.7166666666666667 | 274.047 |
| 0.717361111111111 | 278.603 |
| 0.7180555555555556 | 287.709 |
| 0.71875 | 296.808 |
| 0.7194444444444444 | 296.808 |
| 0.720138888888889 | 287.709 |
| 0.7208333333333333 | 274.047 |
| 0.7215277777777778 | 255.813 |
| 0.7222222222222222 | 242.127 |
| 0.7229166666666668 | 233 |
| 0.7236111111111111 | 219.309 |
| 0.7243055555555555 | 187.378 |
| 0.725 | 201.058 |
| 0.7256944444444445 | 182.82 |
| 0.7263888888888889 | 128.284 |
| 0.7270833333333333 | 182.82 |
| 0.7277777777777777 | 182.82 |
| 0.7284722222222223 | 178.264 |
| 0.7291666666666666 | 178.264 |
| 0.7298611111111111 | 173.709 |
| 0.7305555555555556 | 173.709 |
| 0.7312500000000001 | 178.264 |
| 0.7319444444444444 | 173.709 |
| 0.7326388888888888 | 178.264 |
| 0.7333333333333334 | 173.709 |
| 0.7340277777777778 | 178.264 |
| 0.7347222222222222 | 178.264 |
| 0.7354166666666666 | 178.264 |
| 0.7361111111111112 | 178.264 |
| 0.7368055555555556 | 178.264 |
| 0.7374999999999999 | 178.264 |
| 0.7381944444444444 | 178.264 |
| 0.7388888888888889 | 178.264 |
| 0.7395833333333334 | 173.709 |
| 0.7402777777777777 | 173.709 |
| 0.7409722222222223 | 169.156 |
| 0.7416666666666667 | 173.709 |
| 0.7423611111111111 | 169.156 |
| 0.7430555555555555 | 164.605 |
| 0.74375 | 169.156 |
| 0.7444444444444445 | 164.605 |
| 0.7451388888888889 | 169.156 |
| 0.7458333333333332 | 164.605 |
| 0.7465277777777778 | 164.605 |
| 0.7472222222222222 | 164.605 |
| 0.7479166666666667 | 164.605 |
| 0.748611111111111 | 164.605 |
| 0.7493055555555556 | 164.605 |
| 0.75 | 164.605 |
| 0.7506944444444444 | 164.605 |
| 0.751388888888889 | 160.056 |
| 0.7520833333333333 | 160.056 |
| 0.7527777777777778 | 155.509 |
| 0.7534722222222222 | 155.509 |
| 0.7541666666666668 | 155.509 |
| 0.7548611111111111 | 150.964 |
| 0.7555555555555555 | 150.964 |
| 0.75625 | 150.964 |
| 0.7569444444444445 | 146.423 |
| 0.7576388888888889 | 146.423 |
| 0.7583333333333333 | 146.423 |
| 0.7590277777777777 | 141.884 |
| 0.7597222222222223 | 141.884 |
| 0.7604166666666666 | 137.347 |
| 0.7611111111111111 | 137.347 |
| 0.7618055555555556 | 137.347 |
| 0.7625000000000001 | 132.814 |
| 0.7631944444444444 | 128.284 |
| 0.7638888888888888 | 128.284 |
| 0.7645833333333334 | 128.284 |
| 0.7652777777777778 | 123.758 |
| 0.7659722222222222 | 123.758 |
| 0.7666666666666666 | 119.235 |
| 0.7673611111111112 | 119.235 |
| 0.7680555555555556 | 119.235 |
| 0.7687499999999999 | 114.716 |
| 0.7694444444444444 | 110.201 |
| 0.7701388888888889 | 110.201 |
| 0.7708333333333334 | 110.201 |
| 0.7715277777777777 | 110.201 |
| 0.7722222222222223 | 105.69 |
| 0.7729166666666667 | 105.69 |
| 0.7736111111111111 | 101.184 |
| 0.7743055555555555 | 101.184 |
| 0.775 | 101.184 |
| 0.7756944444444445 | 101.184 |
| 0.7763888888888889 | 101.184 |
| 0.7770833333333332 | 101.184 |
| 0.7777777777777778 | 101.184 |
| 0.7784722222222222 | 101.184 |
| 0.7791666666666667 | 101.184 |
| 0.779861111111111 | 101.184 |
| 0.7805555555555556 | 101.184 |
| 0.78125 | 96.682 |
| 0.7819444444444444 | 96.682 |
| 0.782638888888889 | 92.184 |
| 0.7833333333333333 | 92.184 |
| 0.7840277777777778 | 92.184 |
| 0.7847222222222222 | 87.692 |
| 0.7854166666666668 | 87.692 |
| 0.7861111111111111 | 87.692 |
| 0.7868055555555555 | 87.692 |
| 0.7875 | 83.205 |
| 0.7881944444444445 | 83.205 |
| 0.7888888888888889 | 83.205 |
| 0.7895833333333333 | 83.205 |
| 0.7902777777777777 | 78.722 |
| 0.7909722222222223 | 78.722 |
| 0.7916666666666666 | 78.722 |
| 0.7923611111111111 | 78.722 |
| 0.7930555555555556 | 74.246 |
| 0.7937500000000001 | 74.246 |
| 0.7944444444444444 | 74.246 |
| 0.7951388888888888 | 74.246 |
| 0.7958333333333334 | 69.775 |
| 0.7965277777777778 | 69.775 |
| 0.7972222222222222 | 69.775 |
| 0.7979166666666666 | 69.775 |
| 0.7986111111111112 | 65.31 |
| 0.7993055555555556 | 65.31 |
| 0.7999999999999999 | 65.31 |
| 0.8006944444444444 | 65.31 |
| 0.8013888888888889 | 65.31 |
| 0.8020833333333334 | 65.31 |
| 0.8027777777777777 | 60.85 |
| 0.8034722222222223 | 60.85 |
| 0.8041666666666667 | 60.85 |
| 0.8048611111111111 | 60.85 |
| 0.8055555555555555 | 56.398 |
| 0.80625 | 56.398 |
| 0.8069444444444445 | 56.398 |
| 0.8076388888888889 | 56.398 |
| 0.8083333333333332 | 51.951 |
| 0.8090277777777778 | 51.951 |
| 0.8097222222222222 | 51.951 |
| 0.8104166666666667 | 51.951 |
| 0.811111111111111 | 47.511 |
| 0.8118055555555556 | 47.511 |
| 0.8125 | 47.511 |
| 0.8131944444444444 | 47.511 |
| 0.813888888888889 | 47.511 |
| 0.8145833333333333 | 47.511 |
| 0.8152777777777778 | 43.079 |
| 0.8159722222222222 | 43.079 |
| 0.8166666666666668 | 43.079 |
| 0.8173611111111111 | 43.079 |
| 0.8180555555555555 | 38.653 |
| 0.81875 | 38.653 |
| 0.8194444444444445 | 38.653 |
| 0.8201388888888889 | 38.653 |
| 0.8208333333333333 | 38.653 |
| 0.8215277777777777 | 38.653 |
| 0.8222222222222223 | 34.234 |
| 0.8229166666666666 | 34.234 |
| 0.8236111111111111 | 34.234 |
| 0.8243055555555556 | 29.823 |
| 0.8250000000000001 | 29.823 |
| 0.8256944444444444 | 29.823 |
| 0.8263888888888888 | 29.823 |
| 0.8270833333333334 | 29.823 |
| 0.8277777777777778 | 29.823 |
| 0.8284722222222222 | 25.419 |
| 0.8291666666666666 | 25.419 |
| 0.8298611111111112 | 25.419 |
| 0.8305555555555556 | 25.419 |
| 0.8312499999999999 | 21.024 |
| 0.8319444444444444 | 21.024 |
| 0.8326388888888889 | 21.024 |
| 0.8333333333333334 | 21.024 |
| 0.8340277777777777 | 16.636 |
| 0.8347222222222223 | 16.636 |
| 0.8354166666666667 | 16.636 |
| 0.8361111111111111 | 16.636 |
| 0.8368055555555555 | 16.636 |
| 0.8375 | 12.257 |
| 0.8381944444444445 | 12.257 |
| 0.8388888888888889 | 12.257 |
| 0.8395833333333332 | 12.257 |
| 0.8402777777777778 | 12.257 |
| 0.8409722222222222 | 12.257 |
| 0.8416666666666667 | 7.887 |
| 0.842361111111111 | 7.887 |
| 0.8430555555555556 | 7.887 |
| 0.84375 | 7.887 |
| 0.8444444444444444 | 3.525 |
| 0.845138888888889 | 3.525 |
| 0.8458333333333333 | 3.525 |
| 0.8465277777777778 | 3.525 |
| 0.8472222222222222 | 3.525 |
| 0.8479166666666668 | 3.525 |
| 0.8486111111111111 | 3.525 |
| 0.8493055555555555 | 3.525 |
| 0.85 | 3.525 |
| 0.8506944444444445 | 0 |
| 0.8513888888888889 | 3.525 |
| 0.8520833333333333 | 0 |
| 0.8527777777777777 | 0 |
| 0.8534722222222223 | 0 |
| 0.8541666666666666 | 0 |
| 0.8548611111111111 | 0 |
| 0.8555555555555556 | 0 |
| 0.8562500000000001 | 0 |
| 0.8569444444444444 | 0 |
| 0.8576388888888888 | 0 |
| 0.8583333333333334 | 0 |
| 0.8590277777777778 | 0 |
| 0.8597222222222222 | 0 |
| 0.8604166666666666 | 0 |
| 0.8611111111111112 | 0 |
| 0.8618055555555556 | 0 |
| 0.8624999999999999 | 0 |
| 0.8631944444444444 | 0 |
| 0.8638888888888889 | 0 |
| 0.8645833333333334 | 0 |
| 0.8652777777777777 | 0 |
| 0.8659722222222223 | 0 |
| 0.8666666666666667 | 0 |
| 0.8673611111111111 | 0 |
| 0.8680555555555555 | 0 |
| 0.86875 | 0 |
| 0.8694444444444445 | 0 |
| 0.8701388888888889 | 0 |
| 0.8708333333333332 | 0 |
| 0.8715277777777778 | 0 |
| 0.8722222222222222 | 0 |
| 0.8729166666666667 | 0 |
| 0.873611111111111 | 0 |
| 0.8743055555555556 | 0 |
| 0.875 | 0 |
| 0.8756944444444444 | 0 |
| 0.876388888888889 | 0 |
| 0.8770833333333333 | 0 |
| 0.8777777777777778 | 0 |
| 0.8784722222222222 | 0 |
| 0.8791666666666668 | 0 |
| 0.8798611111111111 | 0 |
| 0.8805555555555555 | 0 |
| 0.88125 | 0 |
| 0.8819444444444445 | 0 |
| 0.8826388888888889 | 0 |
| 0.8833333333333333 | 0 |
| 0.8840277777777777 | 0 |
| 0.8847222222222223 | 0 |
| 0.8854166666666666 | 0 |
| 0.8861111111111111 | 0 |
| 0.8868055555555556 | 0 |
| 0.8875000000000001 | 0 |
| 0.8881944444444444 | 0 |
| 0.8888888888888888 | 0 |
| 0.8895833333333334 | 0 |
| 0.8902777777777778 | 0 |
| 0.8909722222222222 | 0 |
| 0.8916666666666666 | 0 |
| 0.8923611111111112 | 0 |
| 0.8930555555555556 | 0 |
| 0.8937499999999999 | 0 |
| 0.8944444444444444 | 0 |
| 0.8951388888888889 | 0 |
| 0.8958333333333334 | 0 |
| 0.8965277777777777 | 0 |
| 0.8972222222222223 | 0 |
| 0.8979166666666667 | 0 |
| 0.8986111111111111 | 0 |
| 0.8993055555555555 | 0 |
| 0.9 | 0 |
| 0.9006944444444445 | 0 |
| 0.9013888888888889 | 0 |
| 0.9020833333333332 | 0 |
| 0.9027777777777778 | 0 |
| 0.9034722222222222 | 0 |
| 0.9041666666666667 | 0 |
| 0.904861111111111 | 0 |
| 0.9055555555555556 | 0 |
| 0.90625 | 0 |
| 0.9069444444444444 | 0 |
| 0.907638888888889 | 0 |
| 0.9083333333333333 | 0 |
| 0.9090277777777778 | 0 |
| 0.9097222222222222 | 0 |
| 0.9104166666666668 | 0 |
| 0.9111111111111111 | 0 |
| 0.9118055555555555 | 0 |
| 0.9125 | 0 |
| 0.9131944444444445 | 0 |
| 0.9138888888888889 | 0 |
| 0.9145833333333333 | 0 |
| 0.9152777777777777 | 0 |
| 0.9159722222222223 | 0 |
| 0.9166666666666666 | 0 |
| 0.9173611111111111 | 0 |
| 0.9180555555555556 | 0 |
| 0.9187500000000001 | 0 |
| 0.9194444444444444 | 0 |
| 0.9201388888888888 | 0 |
| 0.9208333333333334 | 0 |
| 0.9215277777777778 | 0 |
| 0.9222222222222222 | 0 |
| 0.9229166666666666 | 0 |
| 0.9236111111111112 | 0 |
| 0.9243055555555556 | 0 |
| 0.9249999999999999 | 0 |
| 0.9256944444444444 | 0 |
| 0.9263888888888889 | 0 |
| 0.9270833333333334 | 0 |
| 0.9277777777777777 | 0 |
| 0.9284722222222223 | 0 |
| 0.9291666666666667 | 0 |
| 0.9298611111111111 | 0 |
| 0.9305555555555555 | 0 |
| 0.93125 | 0 |
| 0.9319444444444445 | 0 |
| 0.9326388888888889 | 0 |
| 0.9333333333333332 | 0 |
| 0.9340277777777778 | 0 |
| 0.9347222222222222 | 0 |
| 0.9354166666666667 | 0 |
| 0.936111111111111 | 0 |
| 0.9368055555555556 | 0 |
| 0.9375 | 0 |
| 0.9381944444444444 | 0 |
| 0.938888888888889 | 0 |
| 0.9395833333333333 | 0 |
| 0.9402777777777778 | 0 |
| 0.9409722222222222 | 0 |
| 0.9416666666666668 | 0 |
| 0.9423611111111111 | 0 |
| 0.9430555555555555 | 0 |
| 0.94375 | 0 |
| 0.9444444444444445 | 0 |
| 0.9451388888888889 | 0 |
| 0.9458333333333333 | 0 |
| 0.9465277777777777 | 0 |
| 0.9472222222222223 | 0 |
| 0.9479166666666666 | 0 |
| 0.9486111111111111 | 0 |
| 0.9493055555555556 | 0 |
| 0.9500000000000001 | 0 |
| 0.9506944444444444 | 0 |
| 0.9513888888888888 | 0 |
| 0.9520833333333334 | 0 |
| 0.9527777777777778 | 0 |
| 0.9534722222222222 | 0 |
| 0.9541666666666666 | 0 |
| 0.9548611111111112 | 0 |
| 0.9555555555555556 | 0 |
| 0.9562499999999999 | 0 |
| 0.9569444444444444 | 0 |
| 0.9576388888888889 | 0 |
| 0.9583333333333334 | 0 |
| 0.9590277777777777 | 0 |
| 0.9597222222222223 | 0 |
| 0.9604166666666667 | 0 |
| 0.9611111111111111 | 0 |
| 0.9618055555555555 | 0 |
| 0.9625 | 0 |
| 0.9631944444444445 | 0 |
| 0.9638888888888889 | 0 |
| 0.9645833333333332 | 0 |
| 0.9652777777777778 | 0 |
| 0.9659722222222222 | 0 |
| 0.9666666666666667 | 0 |
| 0.967361111111111 | 0 |
| 0.9680555555555556 | 0 |
| 0.96875 | 0 |
| 0.9694444444444444 | 0 |
| 0.970138888888889 | 0 |
| 0.9708333333333333 | 0 |
| 0.9715277777777778 | 0 |
| 0.9722222222222222 | 0 |
| 0.9729166666666668 | 0 |
| 0.9736111111111111 | 0 |
| 0.9743055555555555 | 0 |
| 0.975 | 0 |
| 0.9756944444444445 | 0 |
| 0.9763888888888889 | 0 |
| 0.9770833333333333 | 0 |
| 0.9777777777777777 | 0 |
| 0.9784722222222223 | 0 |
| 0.9791666666666666 | 0 |
| 0.9798611111111111 | 0 |
| 0.9805555555555556 | 0 |
| 0.9812500000000001 | 0 |
| 0.9819444444444444 | 0 |
| 0.9826388888888888 | 0 |
| 0.9833333333333334 | 0 |
| 0.9840277777777778 | 0 |
| 0.9847222222222222 | 0 |
| 0.9854166666666666 | 0 |
| 0.9861111111111112 | 0 |
| 0.9868055555555556 | 0 |
| 0.9874999999999999 | 0 |
| 0.9881944444444444 | 0 |
| 0.9888888888888889 | 0 |
| 0.9895833333333334 | 0 |
| 0.9902777777777777 | 0 |
| 0.9909722222222223 | 0 |
| 0.9916666666666667 | 0 |
| 0.9923611111111111 | 0 |
| 0.9930555555555555 | 0 |
| 0.99375 | 0 |
| 0.9944444444444445 | 0 |
| 0.9951388888888889 | 0 |
| 0.9958333333333332 | 0 |
| 0.9965277777777778 | 0 |
| 0.9972222222222222 | 0 |
| 0.9979166666666667 | 0 |
| 0.998611111111111 | 0 |
| 0.9993055555555556 | 0 |